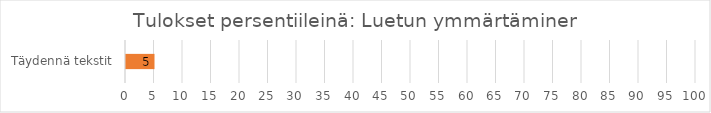
| Category | Tulokset persentiileinä: Luetun ymmärtäminen |
|---|---|
| Täydennä tekstit | 5 |